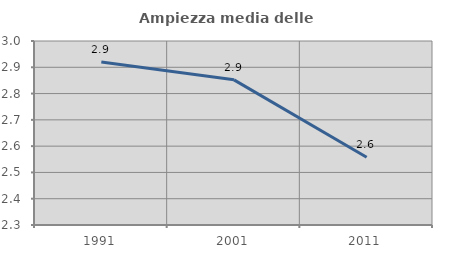
| Category | Ampiezza media delle famiglie |
|---|---|
| 1991.0 | 2.921 |
| 2001.0 | 2.852 |
| 2011.0 | 2.558 |